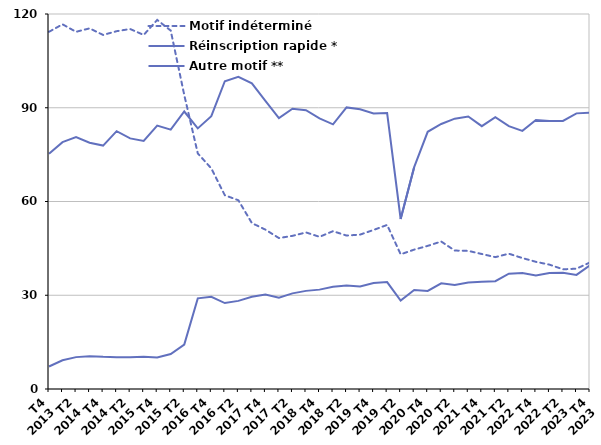
| Category | Motif indéterminé | Réinscription rapide * | Autre motif ** |
|---|---|---|---|
| T4
2013 | 114.3 | 75.3 | 7.2 |
| T1
2014 | 116.7 | 79 | 9.2 |
| T2
2014 | 114.3 | 80.6 | 10.2 |
| T3
2014 | 115.4 | 78.8 | 10.5 |
| T4
2014 | 113.3 | 77.9 | 10.3 |
| T1
2015 | 114.5 | 82.5 | 10.2 |
| T2
2015 | 115.2 | 80.2 | 10.2 |
| T3
2015 | 113.3 | 79.4 | 10.3 |
| T4
2015 | 118.1 | 84.3 | 10.1 |
| T1
2016 | 114.7 | 83 | 11.2 |
| T2
2016 | 94.1 | 88.8 | 14.2 |
| T3
2016 | 75.4 | 83.4 | 29 |
| T4
2016 | 70.6 | 87.3 | 29.5 |
| T1
2017 | 62 | 98.5 | 27.5 |
| T2
2017 | 60.4 | 99.9 | 28.2 |
| T3
2017 | 53.1 | 97.8 | 29.5 |
| T4
2017 | 51 | 92.2 | 30.2 |
| T1
2018 | 48.3 | 86.7 | 29.2 |
| T2
2018 | 49 | 89.7 | 30.6 |
| T3
2018 | 50.1 | 89.2 | 31.4 |
| T4
2018 | 48.7 | 86.6 | 31.8 |
| T1
2019 | 50.5 | 84.7 | 32.7 |
| T2
2019 | 49.1 | 90.1 | 33.1 |
| T3
2019 | 49.4 | 89.5 | 32.8 |
| T4
2019 | 50.9 | 88.2 | 33.9 |
| T1
2020 | 52.5 | 88.3 | 34.2 |
| T2
2020 | 43.1 | 54.4 | 28.3 |
| T3
2020 | 44.6 | 71 | 31.7 |
| T4
2020 | 45.8 | 82.3 | 31.4 |
| T1
2021 | 47.2 | 84.8 | 33.8 |
| T2
2021 | 44.3 | 86.5 | 33.3 |
| T3
2021 | 44.2 | 87.2 | 34.1 |
| T4
2021 | 43.2 | 84.1 | 34.3 |
| T1
2022 | 42.2 | 87 | 34.5 |
| T2
2022 | 43.3 | 84.1 | 36.9 |
| T3
2022 | 41.9 | 82.6 | 37.1 |
| T4
2022 | 40.7 | 86.1 | 36.3 |
| T1
2023 | 39.8 | 85.8 | 37.1 |
| T2
2023 | 38.3 | 85.8 | 37.2 |
| T3
2023 | 38.5 | 88.2 | 36.5 |
| T4
2023 | 40.5 | 88.4 | 39.6 |